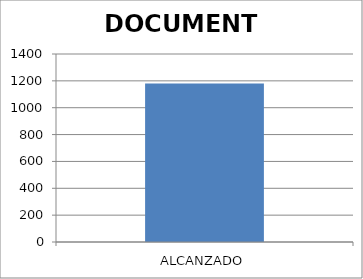
| Category | DOCUMENTO |
|---|---|
| ALCANZADO | 1181 |